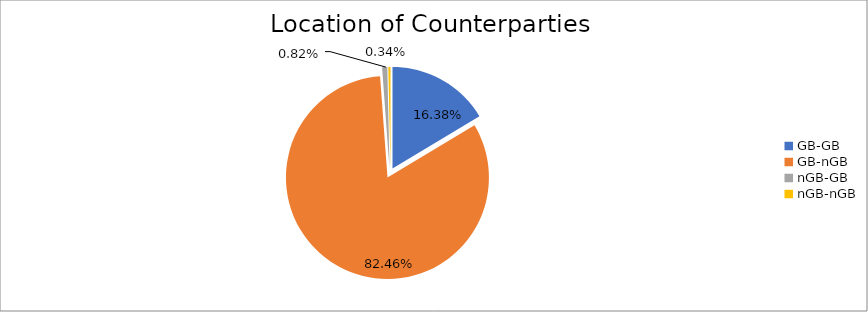
| Category | Series 0 |
|---|---|
| GB-GB | 1571684.003 |
| GB-nGB | 7914425.671 |
| nGB-GB | 78892.045 |
| nGB-nGB | 32992.39 |